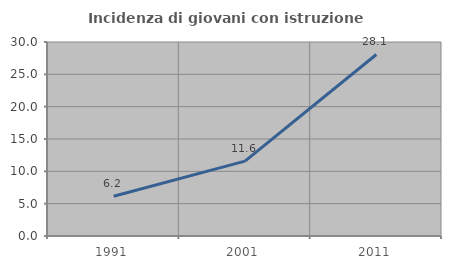
| Category | Incidenza di giovani con istruzione universitaria |
|---|---|
| 1991.0 | 6.151 |
| 2001.0 | 11.573 |
| 2011.0 | 28.07 |